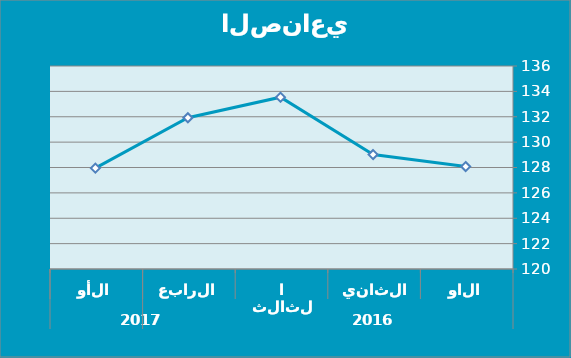
| Category | Series 0 |
|---|---|
| 0 | 128.07 |
| 1 | 129.02 |
| 2 | 133.54 |
| 3 | 131.92 |
| 4 | 127.95 |